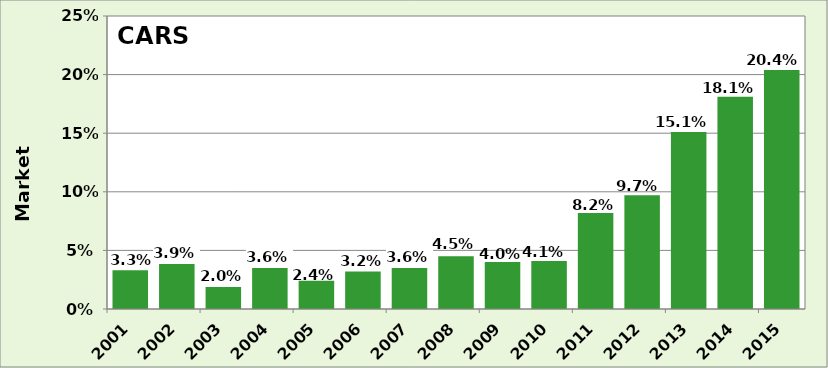
| Category | Series 0 |
|---|---|
| 2001.0 | 0.033 |
| 2002.0 | 0.039 |
| 2003.0 | 0.02 |
| 2004.0 | 0.036 |
| 2005.0 | 0.024 |
| 2006.0 | 0.032 |
| 2007.0 | 0.036 |
| 2008.0 | 0.045 |
| 2009.0 | 0.04 |
| 2010.0 | 0.041 |
| 2011.0 | 0.082 |
| 2012.0 | 0.097 |
| 2013.0 | 0.151 |
| 2014.0 | 0.181 |
| 2015.0 | 0.204 |